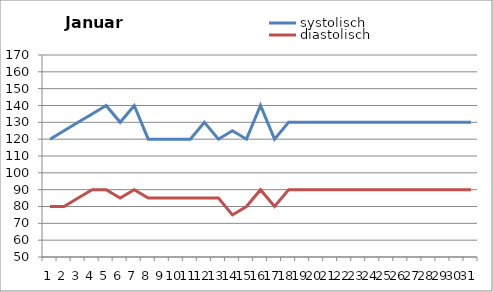
| Category | systolisch | diastolisch |
|---|---|---|
| 0 | 120 | 80 |
| 1 | 125 | 80 |
| 2 | 130 | 85 |
| 3 | 135 | 90 |
| 4 | 140 | 90 |
| 5 | 130 | 85 |
| 6 | 140 | 90 |
| 7 | 120 | 85 |
| 8 | 120 | 85 |
| 9 | 120 | 85 |
| 10 | 120 | 85 |
| 11 | 130 | 85 |
| 12 | 120 | 85 |
| 13 | 125 | 75 |
| 14 | 120 | 80 |
| 15 | 140 | 90 |
| 16 | 120 | 80 |
| 17 | 130 | 90 |
| 18 | 130 | 90 |
| 19 | 130 | 90 |
| 20 | 130 | 90 |
| 21 | 130 | 90 |
| 22 | 130 | 90 |
| 23 | 130 | 90 |
| 24 | 130 | 90 |
| 25 | 130 | 90 |
| 26 | 130 | 90 |
| 27 | 130 | 90 |
| 28 | 130 | 90 |
| 29 | 130 | 90 |
| 30 | 130 | 90 |